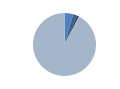
| Category | Series 0 |
|---|---|
| 0 | 146 |
| 1 | 68 |
| 2 | 36 |
| 3 | 7 |
| 4 | 3023 |